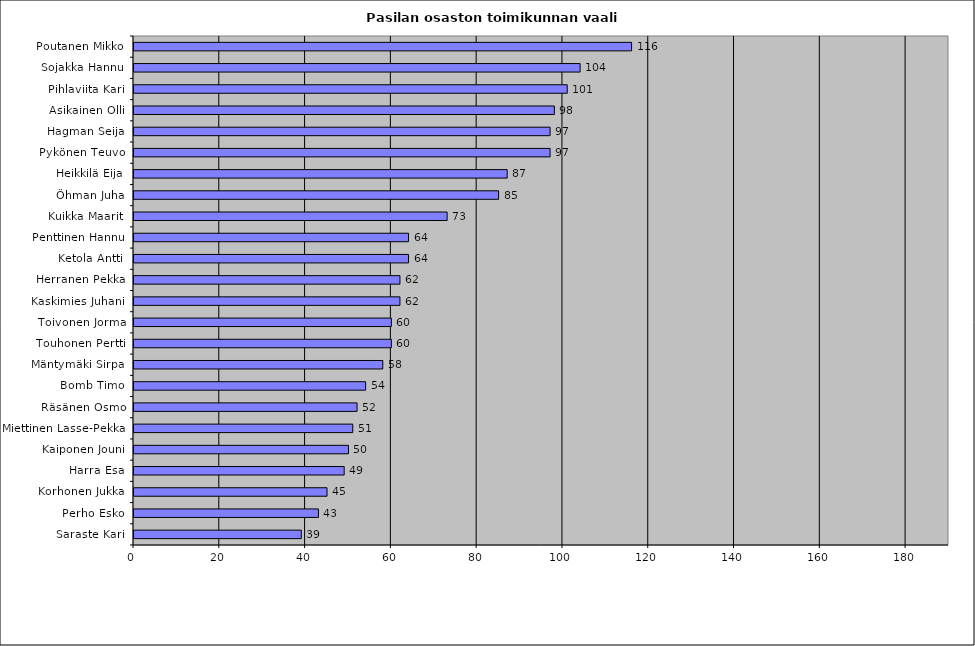
| Category | Series 0 |
|---|---|
| Poutanen Mikko | 116 |
| Sojakka Hannu | 104 |
| Pihlaviita Kari | 101 |
| Asikainen Olli | 98 |
| Hagman Seija | 97 |
| Pykönen Teuvo | 97 |
| Heikkilä Eija | 87 |
| Öhman Juha | 85 |
| Kuikka Maarit | 73 |
| Penttinen Hannu | 64 |
| Ketola Antti | 64 |
| Herranen Pekka | 62 |
| Kaskimies Juhani | 62 |
| Toivonen Jorma | 60 |
| Touhonen Pertti | 60 |
| Mäntymäki Sirpa | 58 |
| Bomb Timo | 54 |
| Räsänen Osmo | 52 |
| Miettinen Lasse-Pekka | 51 |
| Kaiponen Jouni | 50 |
| Harra Esa | 49 |
| Korhonen Jukka | 45 |
| Perho Esko | 43 |
| Saraste Kari | 39 |